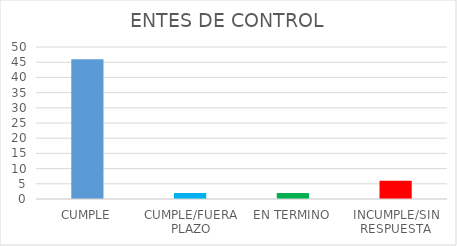
| Category | TOTAL |
|---|---|
| CUMPLE | 46 |
| CUMPLE/FUERA PLAZO | 2 |
| EN TERMINO | 2 |
| INCUMPLE/SIN RESPUESTA | 6 |